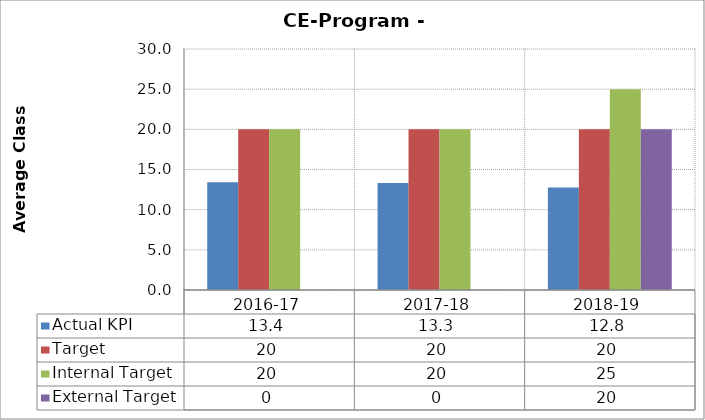
| Category | Actual KPI | Target  | Internal Target | External Target  |
|---|---|---|---|---|
| 2016-17 | 13.402 | 20 | 20 | 0 |
| 2017-18 | 13.333 | 20 | 20 | 0 |
| 2018-19 | 12.767 | 20 | 25 | 20 |